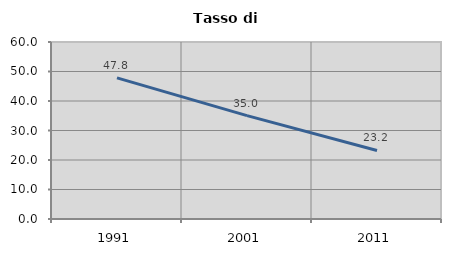
| Category | Tasso di disoccupazione   |
|---|---|
| 1991.0 | 47.826 |
| 2001.0 | 35.044 |
| 2011.0 | 23.237 |